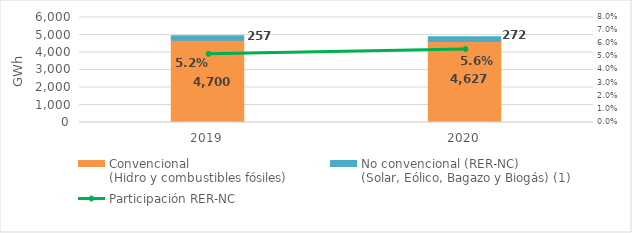
| Category | Convencional
(Hidro y combustibles fósiles) | No convencional (RER-NC)
(Solar, Eólico, Bagazo y Biogás) (1) |
|---|---|---|
| 2019.0 | 4699.863 | 257.388 |
| 2020.0 | 4626.902 | 272.314 |